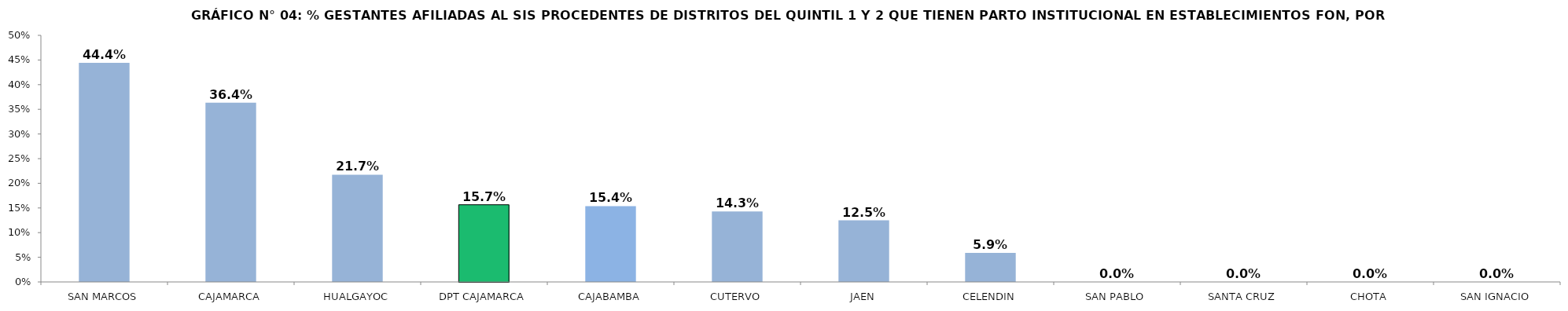
| Category | % GESTANTES AFILIADAS AL SIS PROCEDENTES DE DISTRITOS DEL QUINTIL 1 Y 2 QUE TIENEN PARTO INSTITUCIONAL EN ESTABLECIMIENTOS FON |
|---|---|
| SAN MARCOS | 0.444 |
| CAJAMARCA | 0.364 |
| HUALGAYOC | 0.217 |
| DPT CAJAMARCA | 0.157 |
| CAJABAMBA | 0.154 |
| CUTERVO | 0.143 |
| JAEN | 0.125 |
| CELENDIN | 0.059 |
| SAN PABLO | 0 |
| SANTA CRUZ | 0 |
| CHOTA | 0 |
| SAN IGNACIO | 0 |